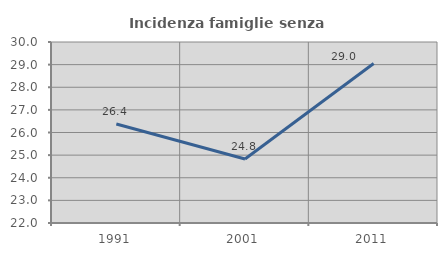
| Category | Incidenza famiglie senza nuclei |
|---|---|
| 1991.0 | 26.374 |
| 2001.0 | 24.829 |
| 2011.0 | 29.049 |